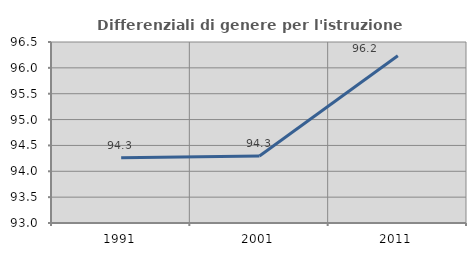
| Category | Differenziali di genere per l'istruzione superiore |
|---|---|
| 1991.0 | 94.264 |
| 2001.0 | 94.296 |
| 2011.0 | 96.234 |